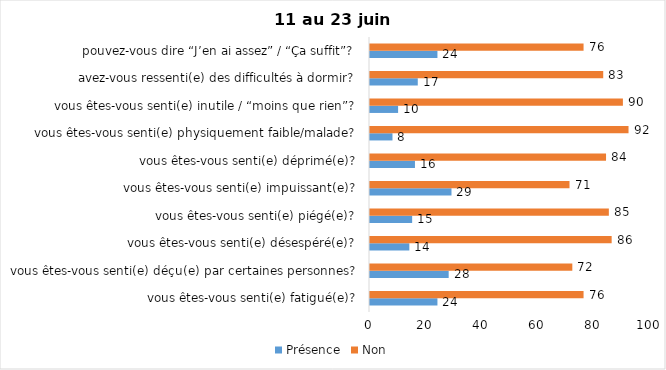
| Category | Présence | Non |
|---|---|---|
| vous êtes-vous senti(e) fatigué(e)? | 24 | 76 |
| vous êtes-vous senti(e) déçu(e) par certaines personnes? | 28 | 72 |
| vous êtes-vous senti(e) désespéré(e)? | 14 | 86 |
| vous êtes-vous senti(e) piégé(e)? | 15 | 85 |
| vous êtes-vous senti(e) impuissant(e)? | 29 | 71 |
| vous êtes-vous senti(e) déprimé(e)? | 16 | 84 |
| vous êtes-vous senti(e) physiquement faible/malade? | 8 | 92 |
| vous êtes-vous senti(e) inutile / “moins que rien”? | 10 | 90 |
| avez-vous ressenti(e) des difficultés à dormir? | 17 | 83 |
| pouvez-vous dire “J’en ai assez” / “Ça suffit”? | 24 | 76 |